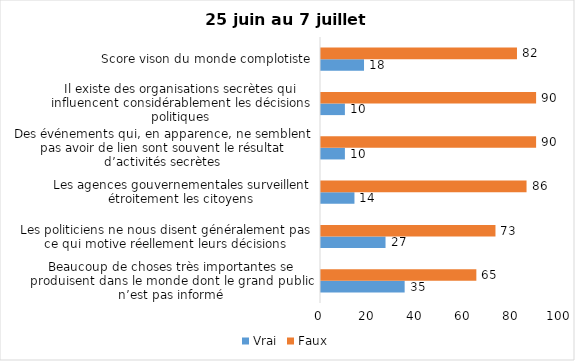
| Category | Vrai | Faux |
|---|---|---|
| Beaucoup de choses très importantes se produisent dans le monde dont le grand public n’est pas informé | 35 | 65 |
| Les politiciens ne nous disent généralement pas ce qui motive réellement leurs décisions | 27 | 73 |
| Les agences gouvernementales surveillent étroitement les citoyens | 14 | 86 |
| Des événements qui, en apparence, ne semblent pas avoir de lien sont souvent le résultat d’activités secrètes | 10 | 90 |
| Il existe des organisations secrètes qui influencent considérablement les décisions politiques | 10 | 90 |
| Score vison du monde complotiste | 18 | 82 |